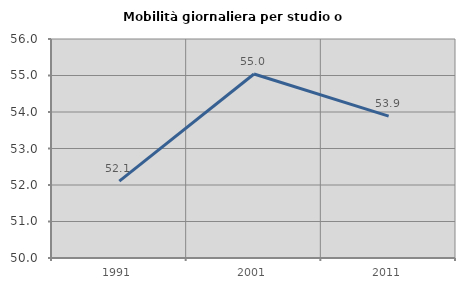
| Category | Mobilità giornaliera per studio o lavoro |
|---|---|
| 1991.0 | 52.106 |
| 2001.0 | 55.042 |
| 2011.0 | 53.887 |